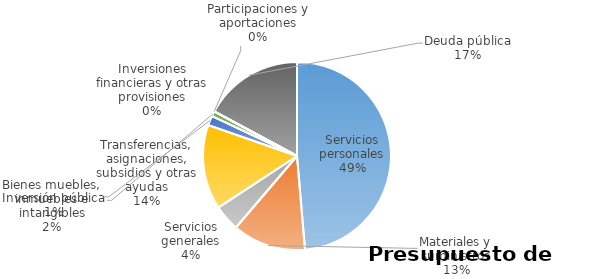
| Category | Series 0 | Series 1 | Series 2 | Series 3 | Series 4 | Series 5 |
|---|---|---|---|---|---|---|
| Servicios personales | 68927402 |  |  |  |  |  |
| Materiales y suministros | 17861021 |  |  |  |  |  |
| Servicios generales | 6393828 |  |  |  |  |  |
| Transferencias, asignaciones, subsidios y otras ayudas | 20659436 |  |  |  |  |  |
| Bienes muebles, inmuebles e intangibles | 2350000 |  |  |  |  |  |
| Inversión pública | 1228646 |  |  |  |  |  |
| Inversiones financieras y otras provisiones | 0 |  |  |  |  |  |
| Participaciones y aportaciones | 0 |  |  |  |  |  |
| Deuda pública | 24295434 |  |  |  |  |  |